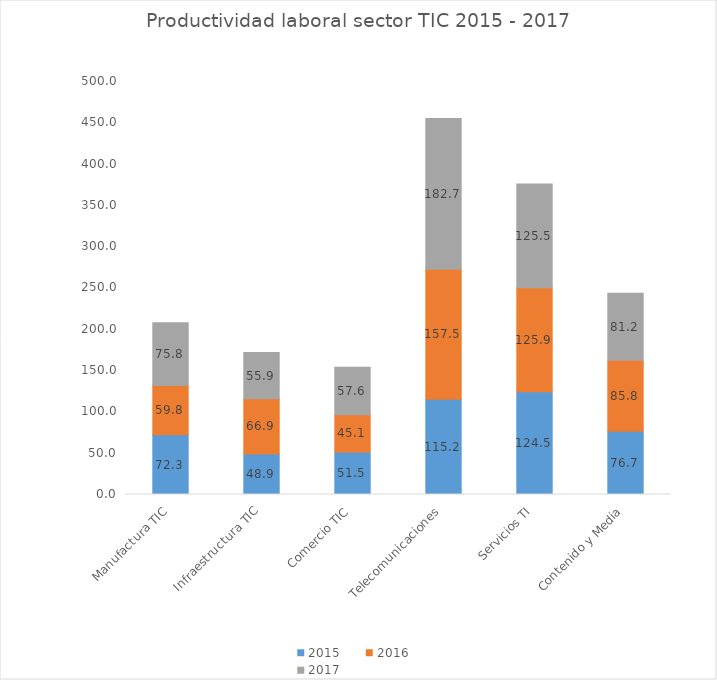
| Category | 2015 | 2016 | 2017 |
|---|---|---|---|
| Manufactura TIC | 72.266 | 59.782 | 75.834 |
| Infraestructura TIC | 48.92 | 66.909 | 55.939 |
| Comercio TIC | 51.459 | 45.143 | 57.586 |
| Telecomunicaciones | 115.178 | 157.453 | 182.652 |
| Servicios TI | 124.486 | 125.861 | 125.511 |
| Contenido y Media | 76.662 | 85.783 | 81.181 |